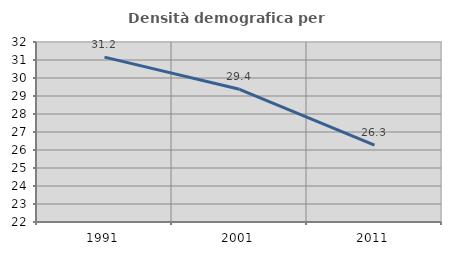
| Category | Densità demografica |
|---|---|
| 1991.0 | 31.161 |
| 2001.0 | 29.371 |
| 2011.0 | 26.266 |